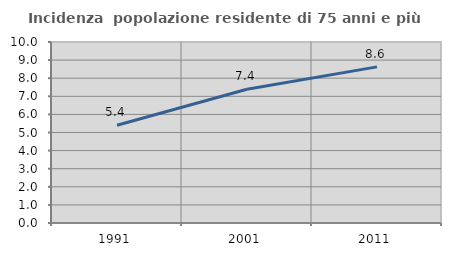
| Category | Incidenza  popolazione residente di 75 anni e più |
|---|---|
| 1991.0 | 5.401 |
| 2001.0 | 7.393 |
| 2011.0 | 8.626 |